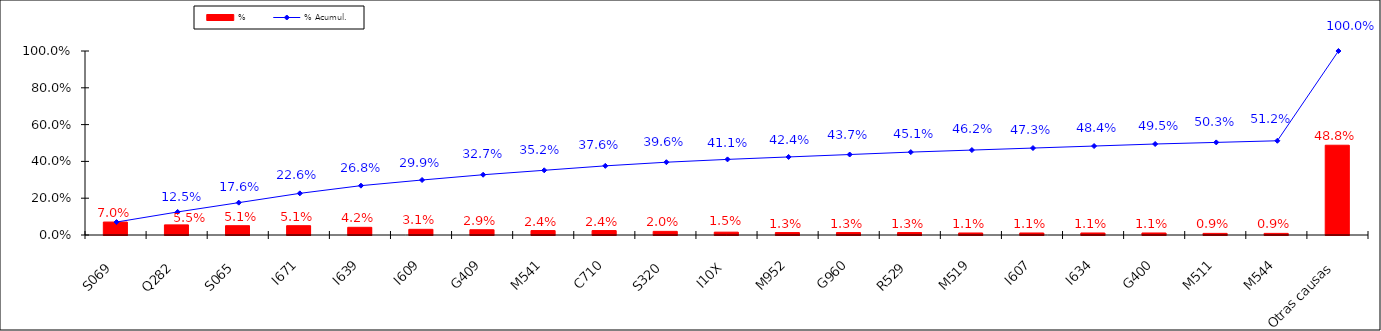
| Category | % |
|---|---|
| S069 | 0.07 |
| Q282 | 0.055 |
| S065 | 0.051 |
| I671 | 0.051 |
| I639 | 0.042 |
| I609 | 0.031 |
| G409 | 0.029 |
| M541 | 0.024 |
| C710 | 0.024 |
| S320 | 0.02 |
| I10X | 0.015 |
| M952 | 0.013 |
| G960 | 0.013 |
| R529 | 0.013 |
| M519 | 0.011 |
| I607 | 0.011 |
| I634 | 0.011 |
| G400 | 0.011 |
| M511 | 0.009 |
| M544 | 0.009 |
| Otras causas | 0.488 |